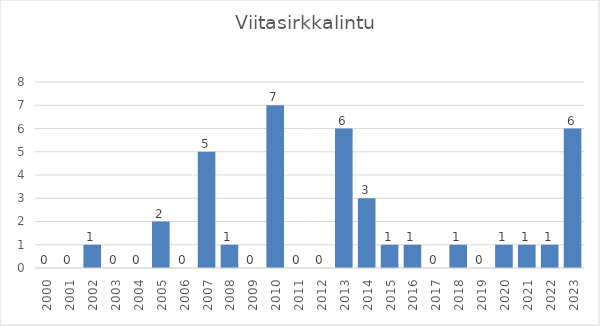
| Category | Series 0 |
|---|---|
| 2000.0 | 0 |
| 2001.0 | 0 |
| 2002.0 | 1 |
| 2003.0 | 0 |
| 2004.0 | 0 |
| 2005.0 | 2 |
| 2006.0 | 0 |
| 2007.0 | 5 |
| 2008.0 | 1 |
| 2009.0 | 0 |
| 2010.0 | 7 |
| 2011.0 | 0 |
| 2012.0 | 0 |
| 2013.0 | 6 |
| 2014.0 | 3 |
| 2015.0 | 1 |
| 2016.0 | 1 |
| 2017.0 | 0 |
| 2018.0 | 1 |
| 2019.0 | 0 |
| 2020.0 | 1 |
| 2021.0 | 1 |
| 2022.0 | 1 |
| 2023.0 | 6 |